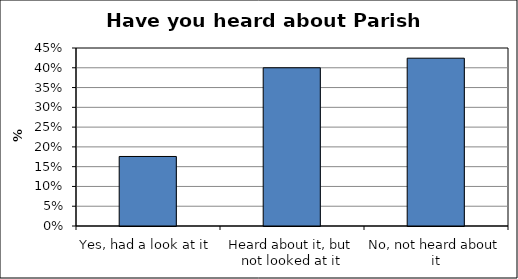
| Category | Series 0 |
|---|---|
| Yes, had a look at it | 0.176 |
| Heard about it, but not looked at it | 0.4 |
| No, not heard about it | 0.424 |